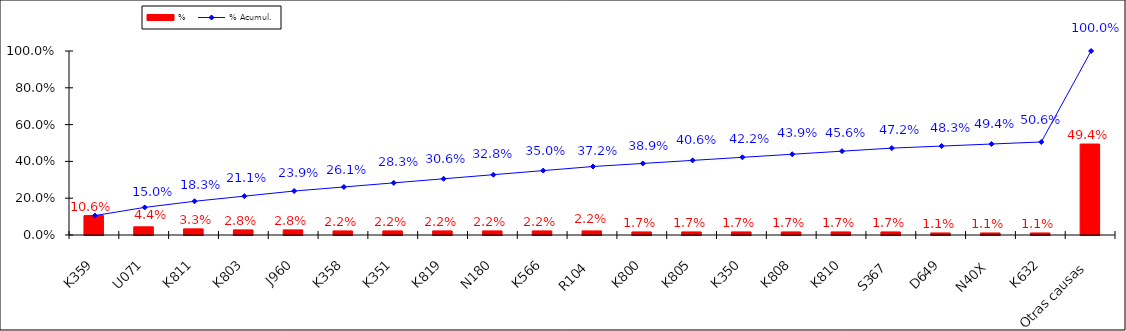
| Category | % |
|---|---|
| K359 | 0.106 |
| U071 | 0.044 |
| K811 | 0.033 |
| K803 | 0.028 |
| J960 | 0.028 |
| K358 | 0.022 |
| K351 | 0.022 |
| K819 | 0.022 |
| N180 | 0.022 |
| K566 | 0.022 |
| R104 | 0.022 |
| K800 | 0.017 |
| K805 | 0.017 |
| K350 | 0.017 |
| K808 | 0.017 |
| K810 | 0.017 |
| S367 | 0.017 |
| D649 | 0.011 |
| N40X | 0.011 |
| K632 | 0.011 |
| Otras causas | 0.494 |